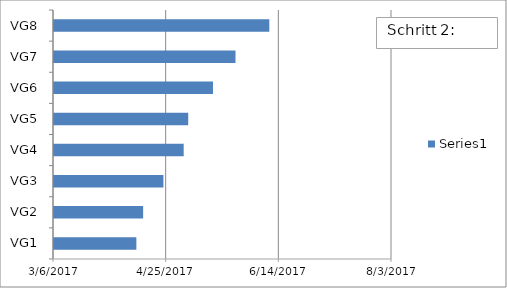
| Category | Series 0 |
|---|---|
| VG1 | 4/12/17 |
| VG2 | 4/15/17 |
| VG3 | 4/24/17 |
| VG4 | 5/3/17 |
| VG5 | 5/5/17 |
| VG6 | 5/16/17 |
| VG7 | 5/26/17 |
| VG8 | 6/10/17 |